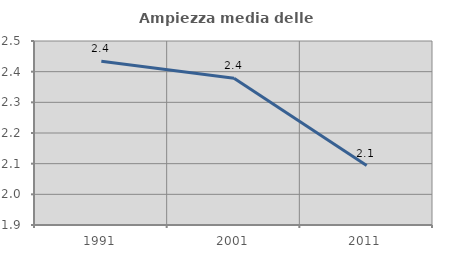
| Category | Ampiezza media delle famiglie |
|---|---|
| 1991.0 | 2.434 |
| 2001.0 | 2.379 |
| 2011.0 | 2.094 |